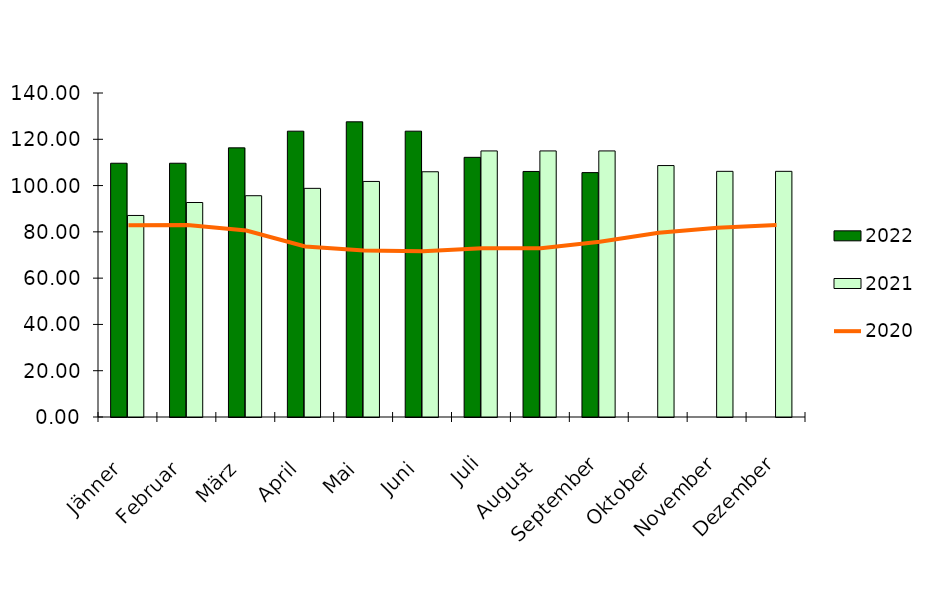
| Category | 2022 | 2021 |
|---|---|---|
| Jänner | 109.65 | 87.083 |
| Februar | 109.65 | 92.683 |
| März | 116.3 | 95.617 |
| April | 123.5 | 98.8 |
| Mai | 127.55 | 101.783 |
| Juni | 123.5 | 105.967 |
| Juli | 112.2 | 114.967 |
| August | 106.1 | 114.967 |
| September | 105.6 | 114.967 |
| Oktober | 0 | 108.65 |
| November | 0 | 106.15 |
| Dezember | 0 | 106.15 |